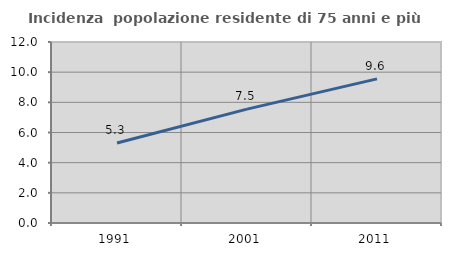
| Category | Incidenza  popolazione residente di 75 anni e più |
|---|---|
| 1991.0 | 5.305 |
| 2001.0 | 7.549 |
| 2011.0 | 9.554 |